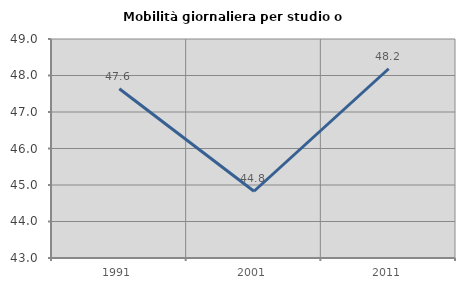
| Category | Mobilità giornaliera per studio o lavoro |
|---|---|
| 1991.0 | 47.635 |
| 2001.0 | 44.829 |
| 2011.0 | 48.185 |